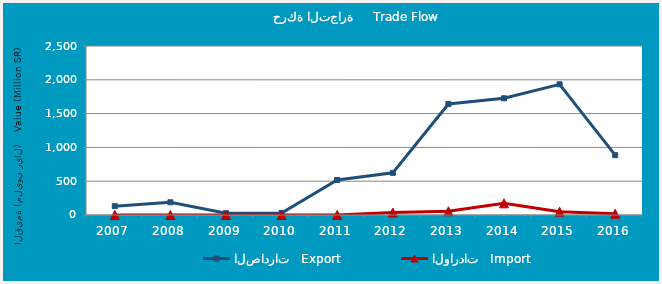
| Category | الصادرات   Export | الواردات   Import |
|---|---|---|
| 2007.0 | 130.632 | 0.874 |
| 2008.0 | 188.008 | 0.204 |
| 2009.0 | 26.733 | 0.096 |
| 2010.0 | 30.681 | 0.353 |
| 2011.0 | 517.618 | 0.405 |
| 2012.0 | 623.808 | 36.604 |
| 2013.0 | 1641.428 | 55.025 |
| 2014.0 | 1726.522 | 172.734 |
| 2015.0 | 1933.151 | 49.835 |
| 2016.0 | 884.972 | 18.751 |